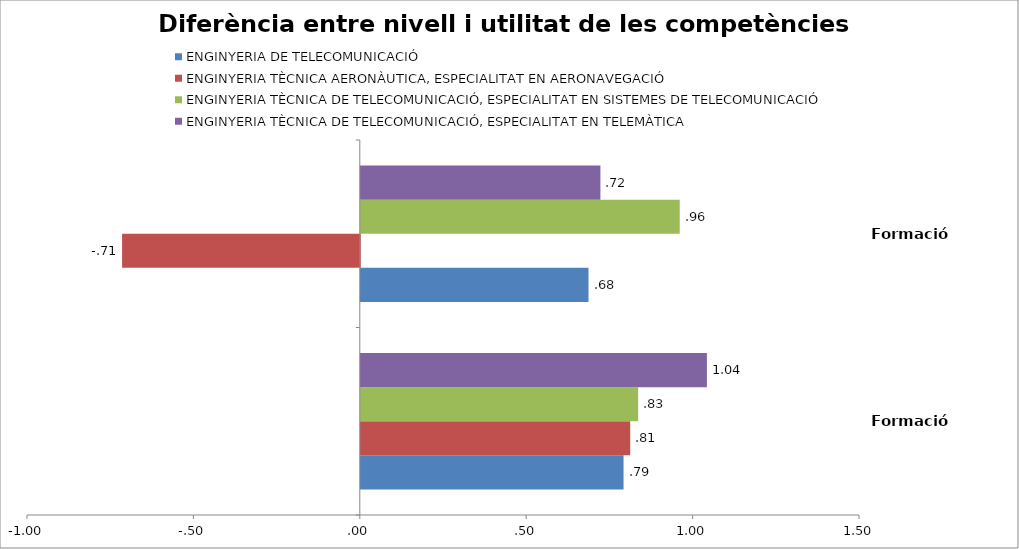
| Category | ENGINYERIA DE TELECOMUNICACIÓ | ENGINYERIA TÈCNICA AERONÀUTICA, ESPECIALITAT EN AERONAVEGACIÓ | ENGINYERIA TÈCNICA DE TELECOMUNICACIÓ, ESPECIALITAT EN SISTEMES DE TELECOMUNICACIÓ | ENGINYERIA TÈCNICA DE TELECOMUNICACIÓ, ESPECIALITAT EN TELEMÀTICA |
|---|---|---|---|---|
| Formació teòrica | 0.789 | 0.81 | 0.833 | 1.04 |
| Formació pràctica | 0.684 | -0.714 | 0.958 | 0.72 |